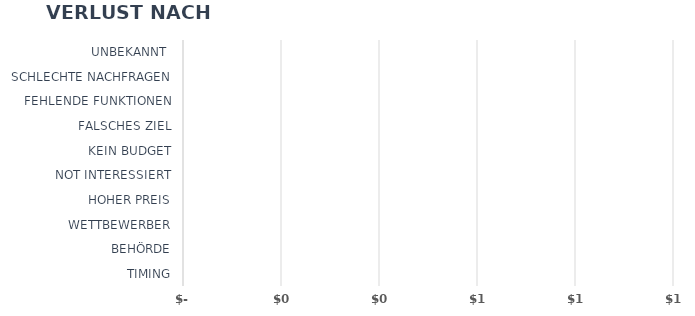
| Category | Series 1 |
|---|---|
| TIMING | 0 |
| BEHÖRDE | 0 |
| WETTBEWERBER | 0 |
| HOHER PREIS | 0 |
| NOT INTERESSIERT | 0 |
| KEIN BUDGET | 0 |
| FALSCHES ZIEL | 0 |
| FEHLENDE FUNKTIONEN | 0 |
| SCHLECHTE NACHFRAGEN | 0 |
| UNBEKANNT  | 0 |